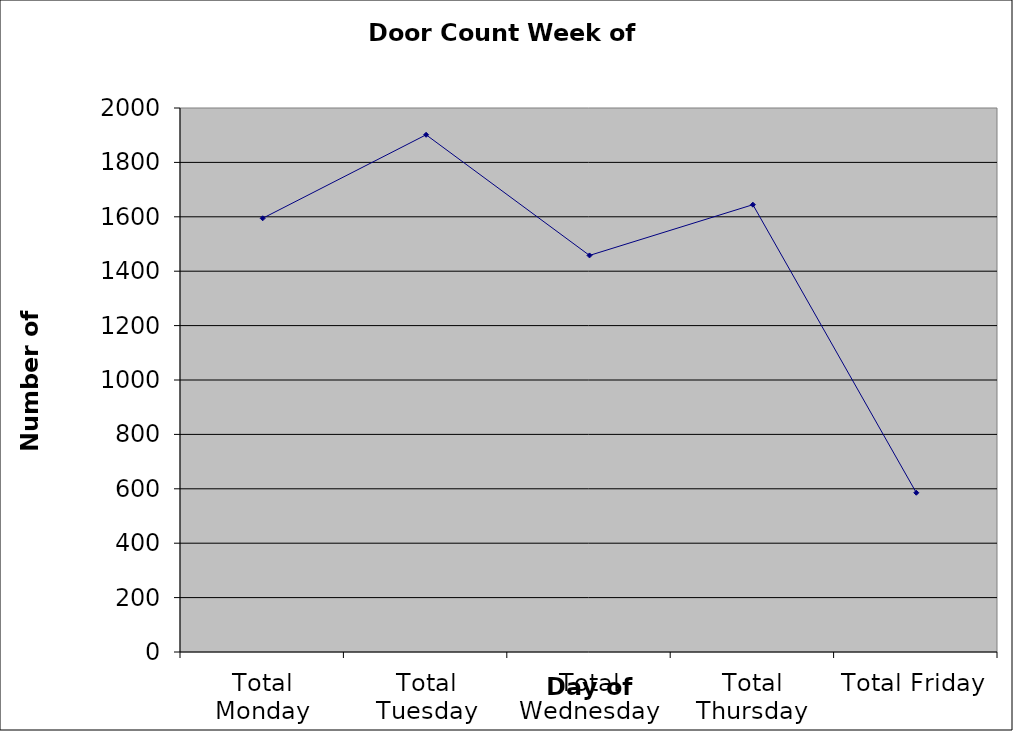
| Category | Series 0 |
|---|---|
| Total Monday | 1594.5 |
| Total Tuesday | 1901.5 |
| Total Wednesday | 1458 |
| Total Thursday | 1644.5 |
| Total Friday | 585.5 |